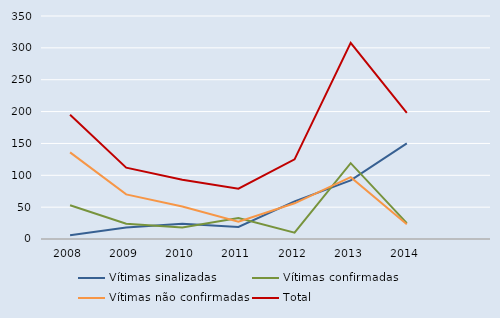
| Category | Vítimas sinalizadas | Vítimas confirmadas | Vítimas não confirmadas | Total |
|---|---|---|---|---|
| 2008.0 | 6 | 53 | 136 | 195 |
| 2009.0 | 18 | 24 | 70 | 112 |
| 2010.0 | 24 | 18 | 51 | 93 |
| 2011.0 | 19 | 33 | 27 | 79 |
| 2012.0 | 59 | 10 | 56 | 125 |
| 2013.0 | 92 | 119 | 97 | 308 |
| 2014.0 | 150 | 25 | 23 | 198 |